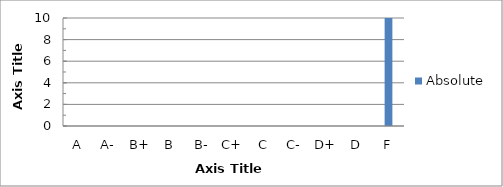
| Category | Absolute |
|---|---|
| A | 0 |
| A- | 0 |
| B+ | 0 |
| B | 0 |
| B- | 0 |
| C+ | 0 |
| C | 0 |
| C- | 0 |
| D+ | 0 |
| D | 0 |
| F | 14 |